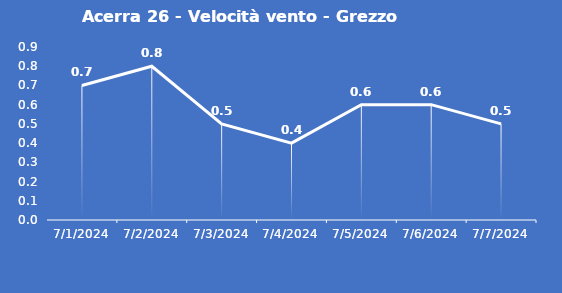
| Category | Acerra 26 - Velocità vento - Grezzo (m/s) |
|---|---|
| 7/1/24 | 0.7 |
| 7/2/24 | 0.8 |
| 7/3/24 | 0.5 |
| 7/4/24 | 0.4 |
| 7/5/24 | 0.6 |
| 7/6/24 | 0.6 |
| 7/7/24 | 0.5 |